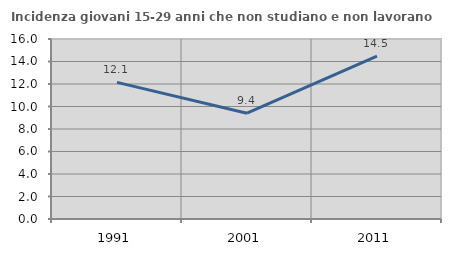
| Category | Incidenza giovani 15-29 anni che non studiano e non lavorano  |
|---|---|
| 1991.0 | 12.142 |
| 2001.0 | 9.404 |
| 2011.0 | 14.479 |